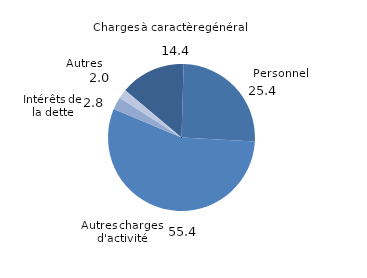
| Category | Series 0 |
|---|---|
| 0 | 14.363 |
| 1 | 25.411 |
| 2 | 55.448 |
| 3 | 2.768 |
| 4 | 2.01 |